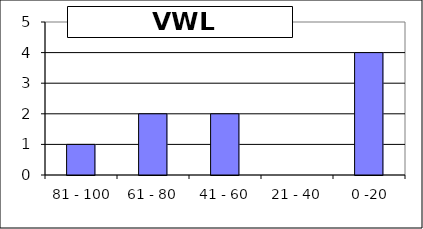
| Category | Series 0 |
|---|---|
|  81 - 100 | 1 |
| 61 - 80 | 2 |
| 41 - 60 | 2 |
| 21 - 40 | 0 |
|  0 -20 | 4 |